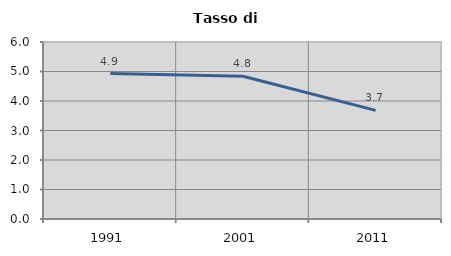
| Category | Tasso di disoccupazione   |
|---|---|
| 1991.0 | 4.93 |
| 2001.0 | 4.841 |
| 2011.0 | 3.682 |